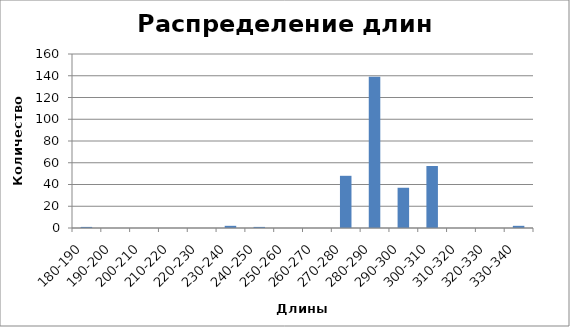
| Category | Series 0 |
|---|---|
| 180-190 | 1 |
| 190-200 | 0 |
| 200-210 | 0 |
| 210-220 | 0 |
| 220-230 | 0 |
| 230-240 | 2 |
| 240-250 | 1 |
| 250-260 | 0 |
| 260-270 | 0 |
| 270-280 | 48 |
| 280-290 | 139 |
| 290-300 | 37 |
| 300-310 | 57 |
| 310-320 | 0 |
| 320-330 | 0 |
| 330-340 | 2 |